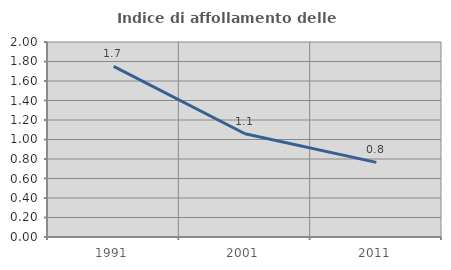
| Category | Indice di affollamento delle abitazioni  |
|---|---|
| 1991.0 | 1.75 |
| 2001.0 | 1.059 |
| 2011.0 | 0.766 |